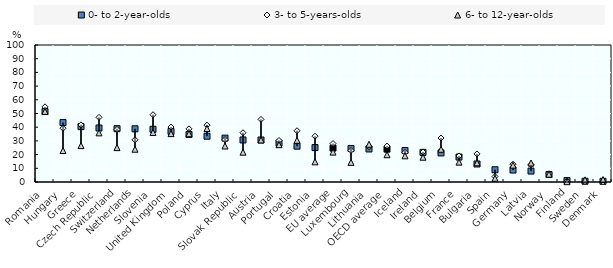
| Category | 0- to 2-year-olds | 3- to 5-years-olds | 6- to 12-year-olds |
|---|---|---|---|
| Romania | 51.419 | 54.865 | 51.545 |
| Hungary | 43.355 | 39.237 | 22.934 |
| Greece | 40.41 | 41.702 | 26.554 |
| Czech Republic | 39.416 | 47.201 | 35.871 |
| Switzerland | 38.934 | 38.37 | 25.092 |
| Netherlands | 38.831 | 30.803 | 23.922 |
| Slovenia | 38.447 | 49.121 | 36.183 |
| United Kingdom | 36.891 | 40.108 | 35.315 |
| Poland | 34.738 | 38.81 | 35.249 |
| Cyprus | 33.427 | 41.488 | 39.035 |
| Italy | 32.026 | 30.965 | 26.287 |
| Slovak Republic | 30.684 | 35.979 | 21.772 |
| Austria | 30.649 | 45.693 | 30.693 |
| Portugal | 28.358 | 30.295 | 27.239 |
| Croatia | 26.16 | 37.426 | 30.447 |
| Estonia | 25.12 | 33.424 | 14.717 |
| EU average | 24.751 | 28.074 | 21.82 |
| Luxembourg | 24.459 | 23.027 | 14.331 |
| Lithuania | 24.101 | 25.7 | 27.548 |
| OECD average | 23.987 | 26.222 | 19.905 |
| Iceland | 22.977 | 21.617 | 19.11 |
| Ireland | 21.619 | 21.946 | 18.099 |
| Belgium | 21.213 | 32.09 | 23.895 |
| France | 18.214 | 19 | 14.497 |
| Bulgaria | 13.139 | 20.508 | 14.012 |
| Spain | 8.93 | 4.009 | 2.737 |
| Germany | 8.742 | 12.972 | 12.285 |
| Latvia | 7.983 | 12.724 | 13.873 |
| Norway | 5.487 | 6.028 | 5.712 |
| Finland | 1.032 | 0.613 | 0.249 |
| Sweden | 0.557 | 0.171 | 1.563 |
| Denmark | 0.493 | 0.167 | 1.794 |